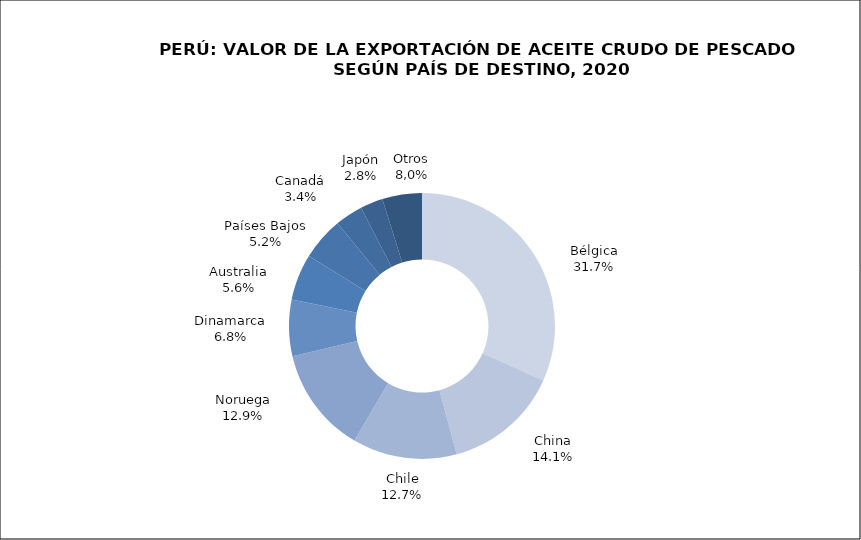
| Category | Series 0 |
|---|---|
| Bélgica | 75500.532 |
| China | 33475.754 |
| Chile | 30226.236 |
| Noruega | 30619.229 |
| Dinamarca | 16267.079 |
| Australia | 13419.7 |
| Países Bajos | 12415.717 |
| Canadá | 8054.772 |
| Japón | 6561.768 |
| Otros | 11465.031 |